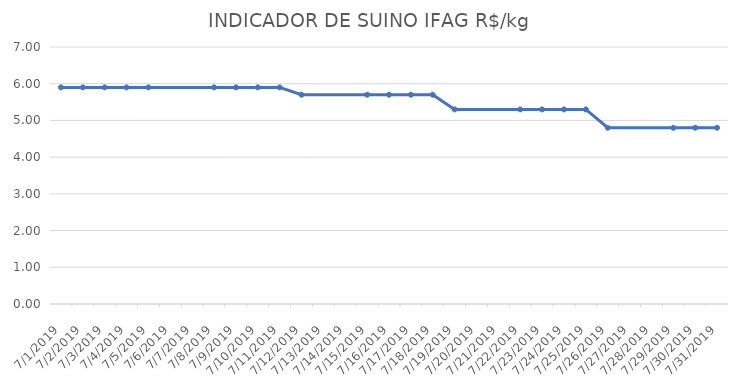
| Category | INDICADOR DE SUINO IFAG |
|---|---|
| 7/1/19 | 5.9 |
| 7/2/19 | 5.9 |
| 7/3/19 | 5.9 |
| 7/4/19 | 5.9 |
| 7/5/19 | 5.9 |
| 7/8/19 | 5.9 |
| 7/9/19 | 5.9 |
| 7/10/19 | 5.9 |
| 7/11/19 | 5.9 |
| 7/12/19 | 5.7 |
| 7/15/19 | 5.7 |
| 7/16/19 | 5.7 |
| 7/17/19 | 5.7 |
| 7/18/19 | 5.7 |
| 7/19/19 | 5.3 |
| 7/22/19 | 5.3 |
| 7/23/19 | 5.3 |
| 7/24/19 | 5.3 |
| 7/25/19 | 5.3 |
| 7/26/19 | 4.8 |
| 7/29/19 | 4.8 |
| 7/30/19 | 4.8 |
| 7/31/19 | 4.8 |